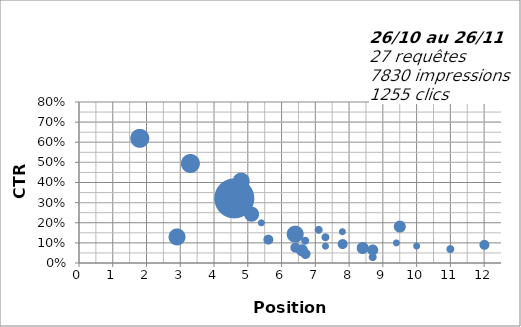
| Category | Series 0 |
|---|---|
| 4.6 | 0.321 |
| 8.7 | 0.029 |
| 2.9 | 0.13 |
| 6.6 | 0.064 |
| 8.4 | 0.075 |
| 6.4 | 0.144 |
| 8.7 | 0.065 |
| 6.7 | 0.046 |
| 6.4 | 0.078 |
| 7.8 | 0.096 |
| 11.0 | 0.069 |
| 12.0 | 0.092 |
| 9.5 | 0.181 |
| 7.3 | 0.084 |
| 3.3 | 0.495 |
| 5.1 | 0.245 |
| 5.6 | 0.118 |
| 1.8 | 0.619 |
| 4.8 | 0.408 |
| 6.7 | 0.11 |
| 10.0 | 0.084 |
| 7.3 | 0.128 |
| 9.4 | 0.1 |
| 7.1 | 0.165 |
| 4.9 | 0.273 |
| 7.8 | 0.156 |
| 5.4 | 0.2 |